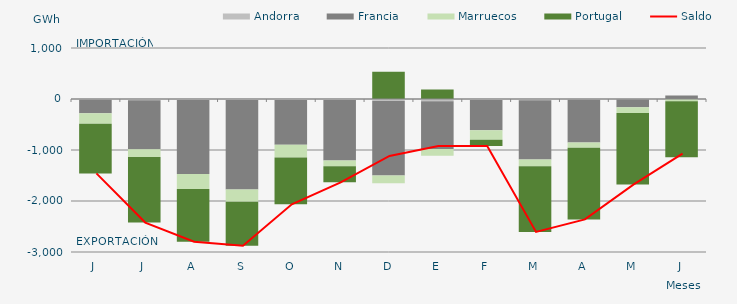
| Category | Andorra | Francia | Marruecos | Portugal |
|---|---|---|---|---|
| J | -16.539 | -262.937 | -205.078 | -974.176 |
| J | -22.256 | -963.789 | -152.863 | -1283.78 |
| A | -20.355 | -1451.936 | -291.598 | -1034.215 |
| S | -19.779 | -1752.3 | -243.405 | -861.179 |
| O | -20.359 | -877.448 | -247.178 | -920.502 |
| N | -20.176 | -1184.993 | -114.159 | -314.568 |
| D | -39.88 | -1462.427 | -149.967 | 535.045 |
| E | -42.454 | -936.901 | -131.692 | 188.334 |
| F | -21.206 | -592.499 | -187.112 | -122.026 |
| M | -23.108 | -1163.333 | -133.704 | -1286.701 |
| A | -14.627 | -836.505 | -105.478 | -1404.431 |
| M | -10.909 | -149.423 | -115.706 | -1398.852 |
| J | -2.08 | 70.4 | -42.701 | -1096.73 |